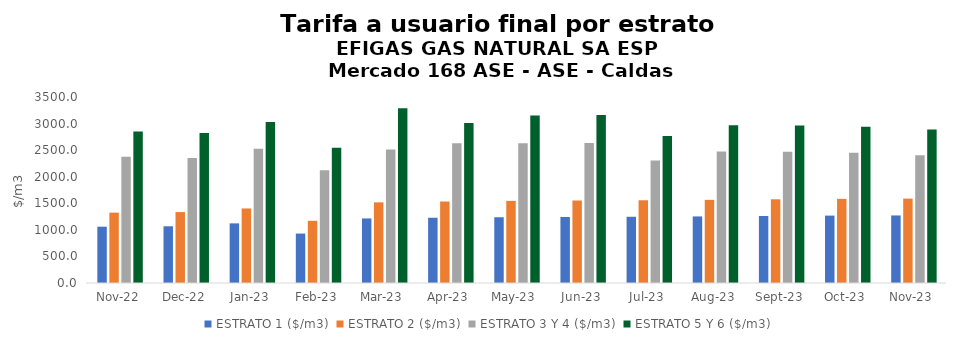
| Category | ESTRATO 1 ($/m3) | ESTRATO 2 ($/m3) | ESTRATO 3 Y 4 ($/m3) | ESTRATO 5 Y 6 ($/m3) |
|---|---|---|---|---|
| 2022-11-01 | 1059.41 | 1324.26 | 2374.06 | 2848.872 |
| 2022-12-01 | 1067.55 | 1334.45 | 2351.81 | 2822.172 |
| 2023-01-01 | 1122.06 | 1402.59 | 2525 | 3030 |
| 2023-02-01 | 930.14 | 1170.78 | 2119.87 | 2543.844 |
| 2023-03-01 | 1214.8 | 1517.42 | 2509.997 | 3287.928 |
| 2023-04-01 | 1227.57 | 1533.36 | 2628.313 | 3011.997 |
| 2023-05-01 | 1237.16 | 1545.35 | 2628.313 | 3153.975 |
| 2023-06-01 | 1242.57 | 1552.1 | 2634.476 | 3161.371 |
| 2023-07-01 | 1246.29 | 1556.75 | 2305.861 | 2767.033 |
| 2023-08-01 | 1252.53 | 1564.55 | 2473.749 | 2968.499 |
| 2023-09-01 | 1261.29 | 1575.49 | 2470.388 | 2964.465 |
| 2023-10-01 | 1268 | 1583.87 | 2451.642 | 2941.971 |
| 2023-11-01 | 1271.17 | 1587.82 | 2405.876 | 2887.051 |